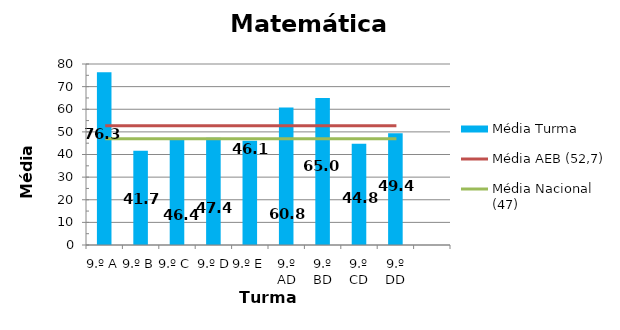
| Category | Média Turma |
|---|---|
| 9.º A | 76.33 |
| 9.º B | 41.68 |
| 9.º C | 46.36 |
| 9.º D | 47.37 |
| 9.º E | 46.07 |
| 9.º AD | 60.82 |
| 9.º BD | 64.95 |
| 9.º CD | 44.75 |
| 9.º DD | 49.4 |